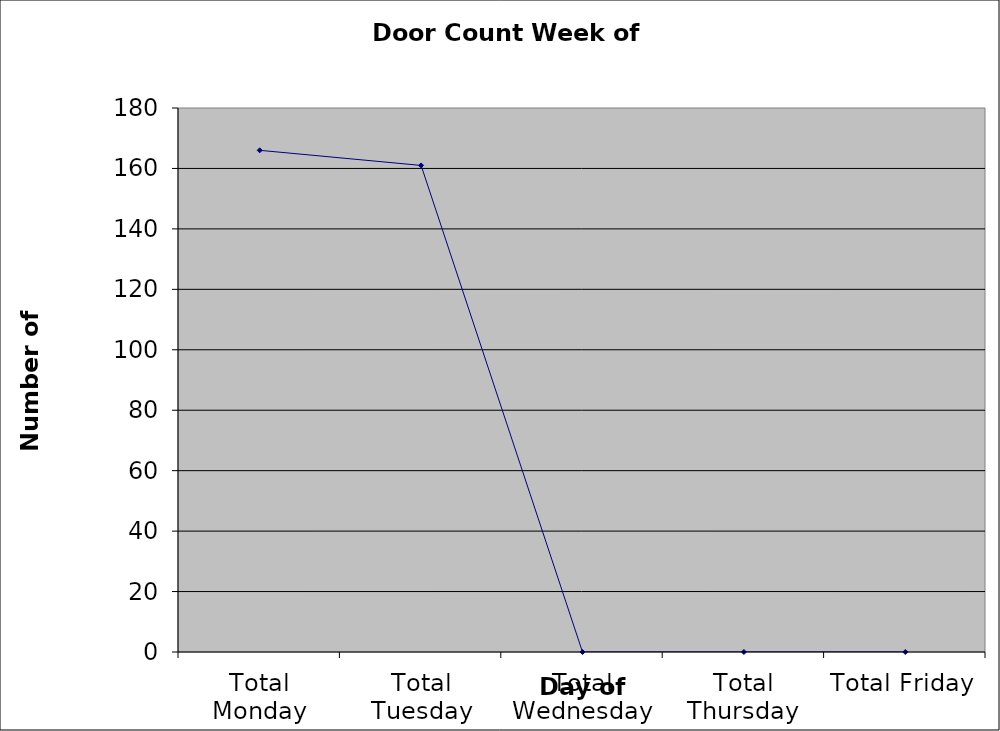
| Category | Series 0 |
|---|---|
| Total Monday | 166 |
| Total Tuesday | 161 |
| Total Wednesday | 0 |
| Total Thursday | 0 |
| Total Friday | 0 |